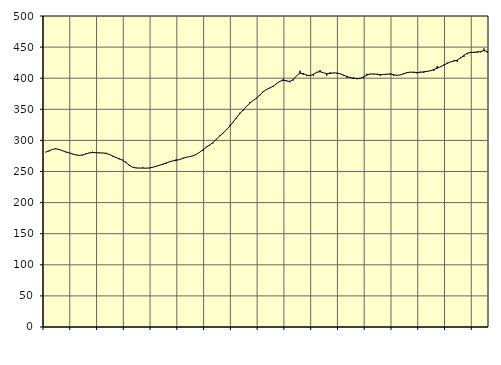
| Category | Piggar | Series 1 |
|---|---|---|
| nan | 281.6 | 281.01 |
| 87.0 | 282.4 | 283.28 |
| 87.0 | 285.4 | 285.46 |
| 87.0 | 287.6 | 286.49 |
| nan | 284.9 | 285.51 |
| 88.0 | 284 | 283.49 |
| 88.0 | 280.9 | 281.61 |
| 88.0 | 280 | 280.01 |
| nan | 277.8 | 278.32 |
| 89.0 | 276.2 | 276.75 |
| 89.0 | 275.6 | 275.94 |
| 89.0 | 275.2 | 276.53 |
| nan | 278.8 | 278.23 |
| 90.0 | 280.2 | 279.85 |
| 90.0 | 281.8 | 280.46 |
| 90.0 | 280.6 | 280.19 |
| nan | 280.8 | 279.93 |
| 91.0 | 280.1 | 279.79 |
| 91.0 | 280.1 | 279.15 |
| 91.0 | 277.3 | 277.49 |
| nan | 274.1 | 275 |
| 92.0 | 271.9 | 272.52 |
| 92.0 | 269.5 | 270.46 |
| 92.0 | 269 | 268.07 |
| nan | 265.8 | 264.45 |
| 93.0 | 259 | 260.16 |
| 93.0 | 256.5 | 256.92 |
| 93.0 | 256.1 | 255.67 |
| nan | 255.2 | 255.59 |
| 94.0 | 256.7 | 255.5 |
| 94.0 | 255.2 | 255.38 |
| 94.0 | 255.2 | 255.69 |
| nan | 256.4 | 256.79 |
| 95.0 | 257.7 | 258.4 |
| 95.0 | 260.2 | 260.02 |
| 95.0 | 260.4 | 261.77 |
| nan | 262.3 | 263.66 |
| 96.0 | 266 | 265.59 |
| 96.0 | 266.9 | 267.01 |
| 96.0 | 270 | 267.86 |
| nan | 268.8 | 269.17 |
| 97.0 | 272 | 271.07 |
| 97.0 | 272.8 | 272.86 |
| 97.0 | 274 | 274 |
| nan | 275.3 | 275.19 |
| 98.0 | 277.6 | 277.51 |
| 98.0 | 280.5 | 280.91 |
| 98.0 | 282.9 | 284.97 |
| nan | 289.9 | 289.04 |
| 99.0 | 291.3 | 292.55 |
| 99.0 | 295.2 | 296.56 |
| 99.0 | 302.3 | 301.58 |
| nan | 307.8 | 306.82 |
| 0.0 | 312.1 | 311.65 |
| 0.0 | 317.1 | 316.81 |
| 0.0 | 324.2 | 322.7 |
| nan | 328.8 | 329.34 |
| 1.0 | 335.1 | 336.29 |
| 1.0 | 344.3 | 342.92 |
| 1.0 | 347.6 | 348.96 |
| nan | 354.9 | 354.6 |
| 2.0 | 361.1 | 359.79 |
| 2.0 | 363.8 | 364.02 |
| 2.0 | 367.3 | 368.02 |
| nan | 372.2 | 373.03 |
| 3.0 | 379.2 | 378.09 |
| 3.0 | 382.5 | 381.8 |
| 3.0 | 383.8 | 384.42 |
| nan | 385.8 | 387.27 |
| 4.0 | 392.1 | 391.13 |
| 4.0 | 395.3 | 394.98 |
| 4.0 | 398.9 | 396.62 |
| nan | 396.6 | 395.58 |
| 5.0 | 393.4 | 394.72 |
| 5.0 | 396.3 | 397.91 |
| 5.0 | 403.9 | 403.99 |
| nan | 411.9 | 407.91 |
| 6.0 | 405.2 | 407.49 |
| 6.0 | 403.2 | 405.01 |
| 6.0 | 404.4 | 404.14 |
| nan | 404.1 | 406.21 |
| 7.0 | 410.2 | 409.45 |
| 7.0 | 413.1 | 410.51 |
| 7.0 | 408.9 | 408.78 |
| nan | 404 | 407.18 |
| 8.0 | 409.7 | 407.56 |
| 8.0 | 409 | 408.5 |
| 8.0 | 407.1 | 408.29 |
| nan | 407.3 | 407.03 |
| 9.0 | 403.9 | 405.01 |
| 9.0 | 400.6 | 402.89 |
| 9.0 | 401.8 | 401.16 |
| nan | 401.2 | 399.93 |
| 10.0 | 398.9 | 399.07 |
| 10.0 | 399.8 | 399.64 |
| 10.0 | 399.7 | 402.2 |
| nan | 407.1 | 404.93 |
| 11.0 | 407.1 | 406.58 |
| 11.0 | 406.1 | 406.87 |
| 11.0 | 406.9 | 406.31 |
| nan | 403.6 | 405.73 |
| 12.0 | 405.6 | 405.75 |
| 12.0 | 405.8 | 406.53 |
| 12.0 | 408.3 | 406.56 |
| nan | 403.5 | 405.45 |
| 13.0 | 404.7 | 404.6 |
| 13.0 | 405.4 | 405.2 |
| 13.0 | 408.4 | 407.02 |
| nan | 410 | 408.97 |
| 14.0 | 409.9 | 409.78 |
| 14.0 | 410.3 | 409.46 |
| 14.0 | 407.7 | 409.18 |
| nan | 410.7 | 409.43 |
| 15.0 | 408.4 | 410.3 |
| 15.0 | 410.5 | 410.97 |
| 15.0 | 412.7 | 412.01 |
| nan | 411.8 | 413.87 |
| 16.0 | 419.6 | 416.04 |
| 16.0 | 419.4 | 418.47 |
| 16.0 | 421.8 | 420.99 |
| nan | 425.1 | 423.81 |
| 17.0 | 426 | 426.11 |
| 17.0 | 428.8 | 427.51 |
| 17.0 | 426.2 | 429.12 |
| nan | 433.9 | 432.37 |
| 18.0 | 434.2 | 436.64 |
| 18.0 | 438.6 | 440.09 |
| 18.0 | 440.5 | 441.63 |
| nan | 440.8 | 441.68 |
| 19.0 | 443.6 | 441.82 |
| 19.0 | 441.5 | 442.94 |
| 19.0 | 447.7 | 444.36 |
| nan | 441.1 | 442.85 |